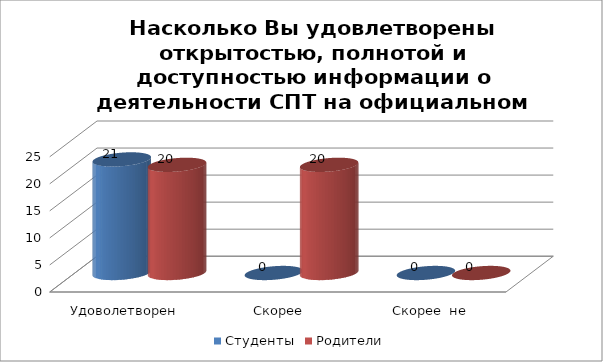
| Category | Студенты | Родители |
|---|---|---|
| Удоволетворен | 21 | 20 |
| Скорее удовлетворен | 0 | 20 |
| Скорее  не удовлетворен | 0 | 0 |